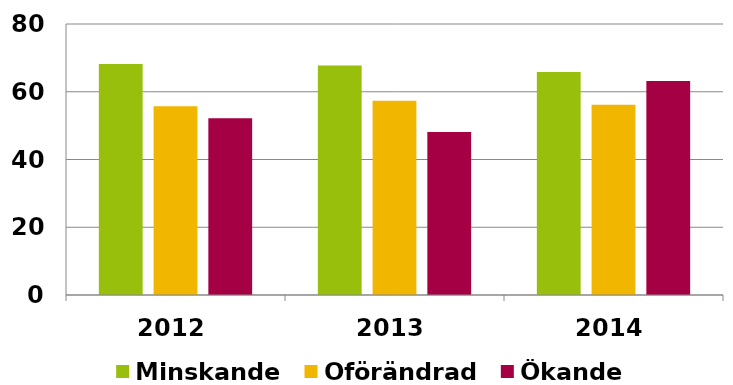
| Category | Minskande | Oförändrad | Ökande |
|---|---|---|---|
| 2012.0 | 68.215 | 55.689 | 52.21 |
| 2013.0 | 67.717 | 57.37 | 48.108 |
| 2014.0 | 65.794 | 56.16 | 63.198 |